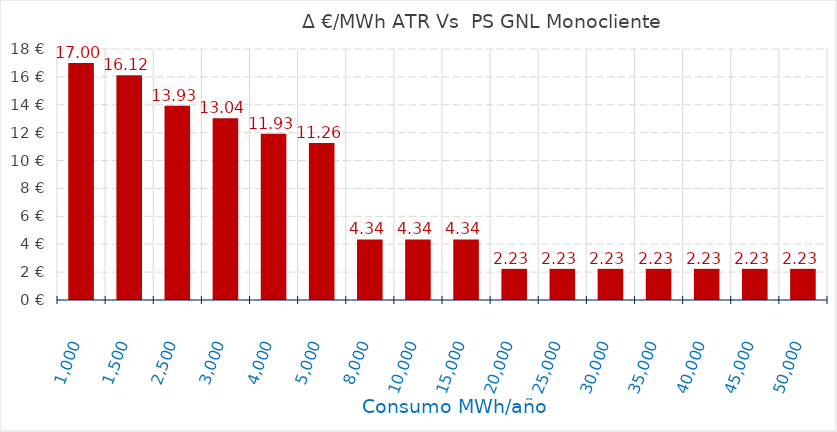
| Category | D €/MWh |
|---|---|
| 1000.0 | 17.004 |
| 1500.0 | 16.117 |
| 2500.0 | 13.93 |
| 3000.0 | 13.042 |
| 4000.0 | 11.931 |
| 5000.0 | 11.264 |
| 8000.0 | 4.341 |
| 10000.0 | 4.341 |
| 15000.0 | 4.341 |
| 20000.0 | 2.235 |
| 25000.0 | 2.235 |
| 30000.0 | 2.235 |
| 35000.0 | 2.235 |
| 40000.0 | 2.235 |
| 45000.0 | 2.235 |
| 50000.0 | 2.235 |